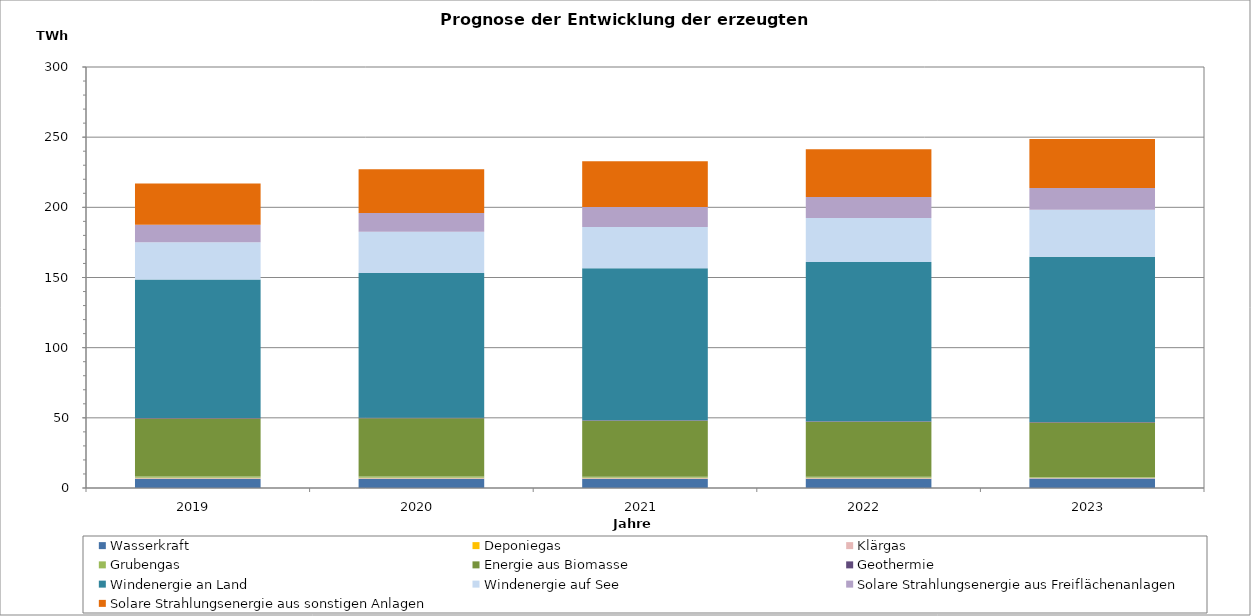
| Category | Wasserkraft | Deponiegas | Klärgas | Grubengas | Energie aus Biomasse | Geothermie | Windenergie an Land | Windenergie auf See | Solare Strahlungsenergie aus Freiflächenanlagen | Solare Strahlungsenergie aus sonstigen Anlagen |
|---|---|---|---|---|---|---|---|---|---|---|
| 2019.0 | 6514.587 | 301.193 | 525.58 | 881.084 | 41351.62 | 286.386 | 98799.183 | 26466.161 | 12405.123 | 29472.576 |
| 2020.0 | 6579.213 | 279.403 | 531.006 | 853.316 | 41517.18 | 311.858 | 103214.502 | 29387.973 | 13329.945 | 31131.168 |
| 2021.0 | 6607.816 | 143.241 | 533.533 | 751.801 | 39872.884 | 335.633 | 108375.196 | 29373.851 | 14203.213 | 32698.217 |
| 2022.0 | 6654.341 | 106.025 | 537.508 | 691.04 | 39296.779 | 360.21 | 113428.189 | 31352.828 | 14965.643 | 33999.158 |
| 2023.0 | 6700.926 | 94.786 | 541.487 | 442.155 | 38943.147 | 384.818 | 117767.902 | 33371.728 | 15517.25 | 34914.597 |